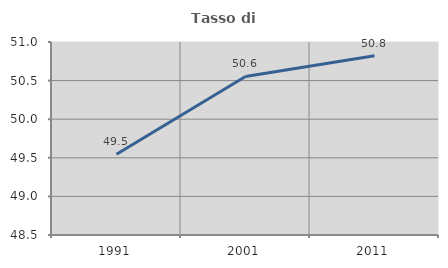
| Category | Tasso di occupazione   |
|---|---|
| 1991.0 | 49.545 |
| 2001.0 | 50.554 |
| 2011.0 | 50.821 |